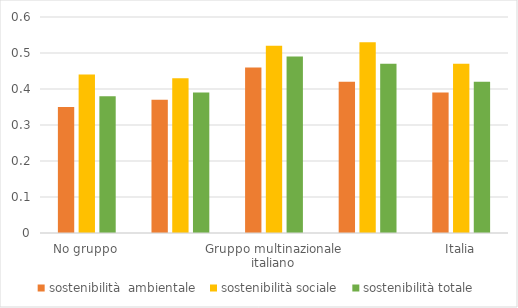
| Category | sostenibilità  ambientale  | sostenibilità sociale  | sostenibilità totale |
|---|---|---|---|
| No gruppo | 0.35 | 0.44 | 0.38 |
| Gruppo  | 0.37 | 0.43 | 0.39 |
| Gruppo multinazionale italiano | 0.46 | 0.52 | 0.49 |
| Gruppo multinazionale estero | 0.42 | 0.53 | 0.47 |
| Italia | 0.39 | 0.47 | 0.42 |